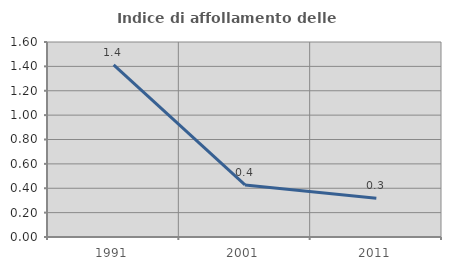
| Category | Indice di affollamento delle abitazioni  |
|---|---|
| 1991.0 | 1.412 |
| 2001.0 | 0.427 |
| 2011.0 | 0.319 |